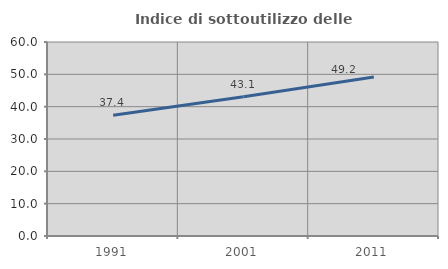
| Category | Indice di sottoutilizzo delle abitazioni  |
|---|---|
| 1991.0 | 37.361 |
| 2001.0 | 43.1 |
| 2011.0 | 49.192 |